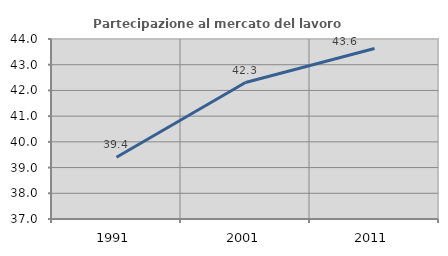
| Category | Partecipazione al mercato del lavoro  femminile |
|---|---|
| 1991.0 | 39.4 |
| 2001.0 | 42.308 |
| 2011.0 | 43.63 |